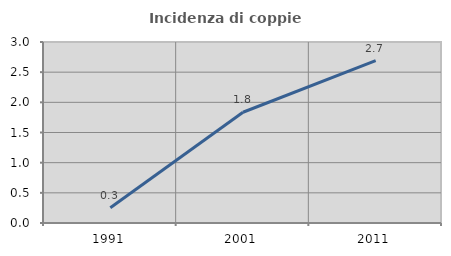
| Category | Incidenza di coppie miste |
|---|---|
| 1991.0 | 0.252 |
| 2001.0 | 1.836 |
| 2011.0 | 2.692 |